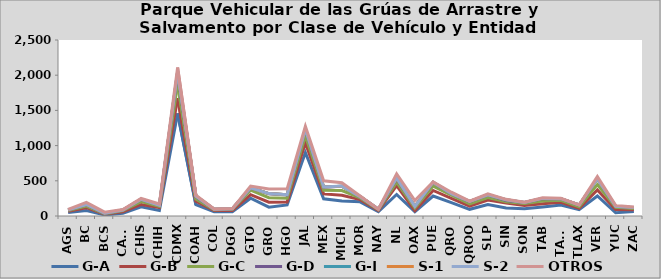
| Category | G-A | G-B | G-C | G-D | G-I | S-1 | S-2 | OTROS |
|---|---|---|---|---|---|---|---|---|
| AGS | 50 | 18 | 11 | 7 | 1 | 0 | 0 | 7 |
| BC | 77 | 41 | 22 | 22 | 1 | 0 | 1 | 30 |
| BCS | 15 | 11 | 4 | 3 | 7 | 0 | 0 | 15 |
| CAMP | 38 | 22 | 16 | 10 | 0 | 0 | 0 | 5 |
| CHIS | 131 | 33 | 40 | 34 | 0 | 0 | 0 | 11 |
| CHIH | 78 | 44 | 14 | 17 | 0 | 0 | 0 | 17 |
| CDMX | 1458 | 219 | 199 | 153 | 20 | 0 | 1 | 59 |
| COAH | 162 | 48 | 32 | 33 | 8 | 0 | 0 | 13 |
| COL | 60 | 18 | 10 | 8 | 0 | 0 | 0 | 5 |
| DGO | 61 | 18 | 18 | 6 | 0 | 0 | 0 | 2 |
| GTO | 253 | 50 | 63 | 35 | 1 | 0 | 0 | 23 |
| GRO | 126 | 70 | 64 | 57 | 1 | 0 | 0 | 65 |
| HGO | 158 | 41 | 54 | 48 | 2 | 0 | 0 | 83 |
| JAL | 902 | 136 | 103 | 88 | 7 | 0 | 0 | 38 |
| MEX | 245 | 69 | 50 | 44 | 5 | 0 | 0 | 87 |
| MICH | 213 | 82 | 67 | 61 | 0 | 0 | 2 | 48 |
| MOR | 201 | 32 | 24 | 18 | 0 | 0 | 0 | 10 |
| NAY | 61 | 18 | 10 | 8 | 0 | 0 | 0 | 0 |
| NL | 306 | 125 | 49 | 45 | 12 | 0 | 2 | 60 |
| OAX | 62 | 13 | 39 | 21 | 1 | 0 | 0 | 84 |
| PUE | 284 | 79 | 62 | 51 | 2 | 1 | 2 | 4 |
| QRO | 191 | 60 | 45 | 20 | 2 | 0 | 0 | 20 |
| QROO | 95 | 44 | 34 | 32 | 1 | 0 | 0 | 4 |
| SLP | 162 | 64 | 35 | 40 | 1 | 0 | 0 | 13 |
| SIN | 115 | 71 | 17 | 18 | 9 | 0 | 0 | 7 |
| SON | 104 | 45 | 28 | 16 | 0 | 0 | 0 | 4 |
| TAB | 128 | 46 | 40 | 35 | 1 | 0 | 0 | 8 |
| TAMS | 157 | 39 | 27 | 21 | 1 | 0 | 1 | 7 |
| TLAX | 89 | 22 | 22 | 23 | 0 | 0 | 0 | 2 |
| VER | 285 | 86 | 75 | 83 | 1 | 0 | 0 | 30 |
| YUC | 47 | 44 | 34 | 12 | 2 | 0 | 0 | 12 |
| ZAC | 65 | 24 | 17 | 13 | 0 | 0 | 2 | 6 |